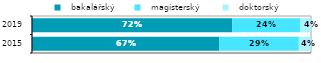
| Category |   bakalářský |   magisterský  |   doktorský |
|---|---|---|---|
| 2015.0 | 0.672 | 0.285 | 0.044 |
| 2019.0 | 0.717 | 0.245 | 0.038 |